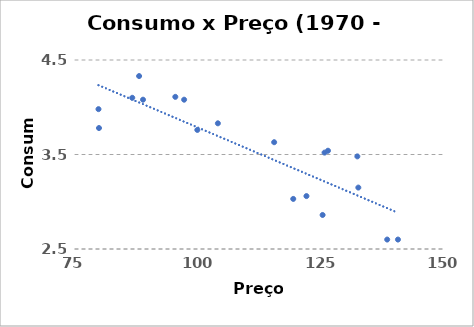
| Category | Series 0 |
|---|---|
| 125.6 | 2.86 |
| 132.9 | 3.15 |
| 126.0 | 3.52 |
| 119.6 | 3.03 |
| 138.8 | 2.6 |
| 141.0 | 2.6 |
| 122.3 | 3.06 |
| 132.7 | 3.48 |
| 126.7 | 3.54 |
| 115.7 | 3.63 |
| 104.2 | 3.83 |
| 95.5 | 4.11 |
| 88.1 | 4.33 |
| 88.9 | 4.08 |
| 97.3 | 4.08 |
| 100.0 | 3.76 |
| 86.7 | 4.1 |
| 79.8 | 3.98 |
| 79.9 | 3.78 |